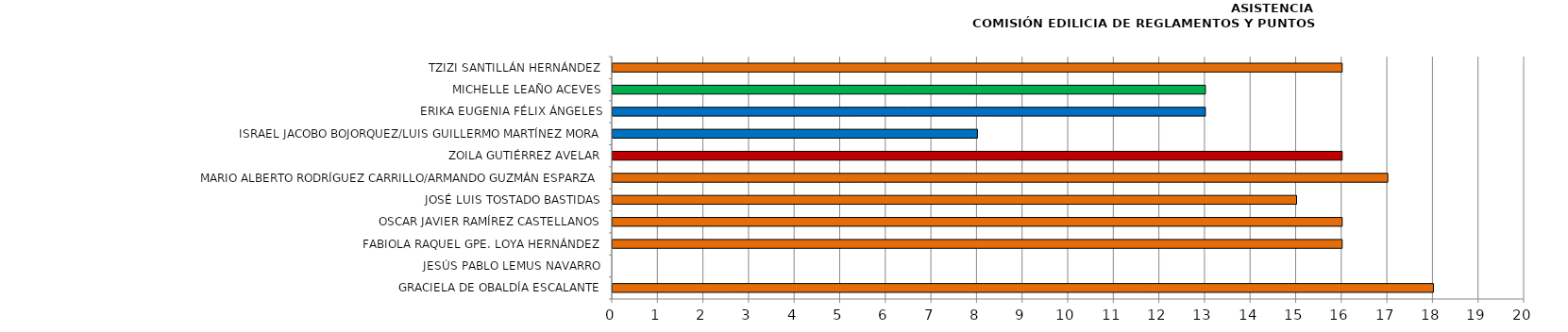
| Category | Series 0 |
|---|---|
| GRACIELA DE OBALDÍA ESCALANTE | 18 |
| JESÚS PABLO LEMUS NAVARRO | 0 |
| FABIOLA RAQUEL GPE. LOYA HERNÁNDEZ | 16 |
| OSCAR JAVIER RAMÍREZ CASTELLANOS | 16 |
| JOSÉ LUIS TOSTADO BASTIDAS | 15 |
| MARIO ALBERTO RODRÍGUEZ CARRILLO/ARMANDO GUZMÁN ESPARZA | 17 |
| ZOILA GUTIÉRREZ AVELAR | 16 |
| ISRAEL JACOBO BOJORQUEZ/LUIS GUILLERMO MARTÍNEZ MORA | 8 |
| ERIKA EUGENIA FÉLIX ÁNGELES | 13 |
| MICHELLE LEAÑO ACEVES | 13 |
| TZIZI SANTILLÁN HERNÁNDEZ | 16 |